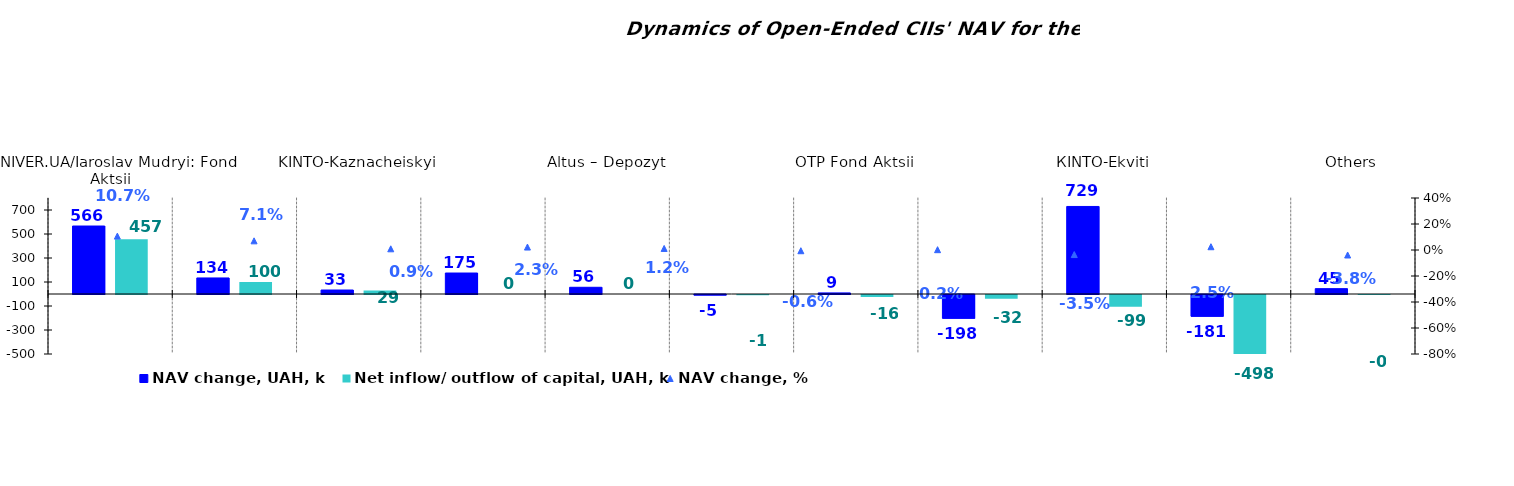
| Category | NAV change, UAH, k | Net inflow/ outflow of capital, UAH, k |
|---|---|---|
| UNIVER.UA/Iaroslav Mudryi: Fond Aktsii | 566.497 | 457.175 |
| VSI | 133.829 | 100.492 |
| KINTO-Kaznacheiskyi | 33.086 | 28.518 |
| UNIVER.UA/Myhailo Hrushevskyi: Fond Derzhavnykh Paperiv | 174.869 | 0 |
| Altus – Depozyt | 55.948 | 0 |
| Altus – Zbalansovanyi | -4.938 | -1.094 |
| OTP Fond Aktsii | 9.149 | -16.358 |
| КІNТО-Klasychnyi | -197.924 | -31.872 |
| КІNTO-Ekviti | 729.458 | -98.538 |
| OTP Klasychnyi | -181.288 | -498.099 |
| Others | 44.565 | -0.004 |